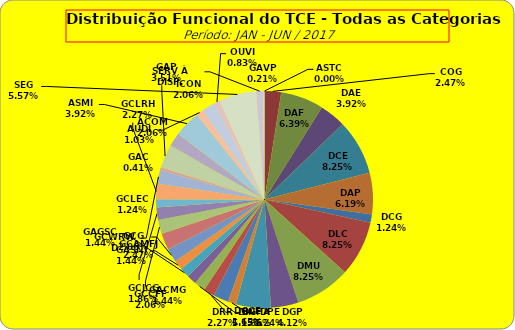
| Category | ASTC |
|---|---|
| ASTC | 0 |
| COG | 12 |
| DAF | 31 |
| DAE | 19 |
| DCE | 40 |
| DAP | 30 |
| DCG | 6 |
| DLC | 40 |
| DMU | 40 |
| DGP | 20 |
| DIN | 25 |
| DPE | 6 |
| DRR | 11 |
| DGCE | 8 |
| DGPA | 8 |
| GACMG | 7 |
| GAGSC | 7 |
| GASNI | 7 |
| GCG | 10 |
| GCAMFJ | 12 |
| GCCFF | 10 |
| GCJCG | 9 |
| GCLEC | 6 |
| GCLRH | 11 |
| GCWRWD | 10 |
| GAC | 2 |
| GAP | 17 |
| ACOM | 10 |
| ASMI | 19 |
| AUDI | 5 |
| ICON | 10 |
| OUVI | 4 |
| SEG | 27 |
| SERV À DISP. | 5 |
| GAVP | 1 |